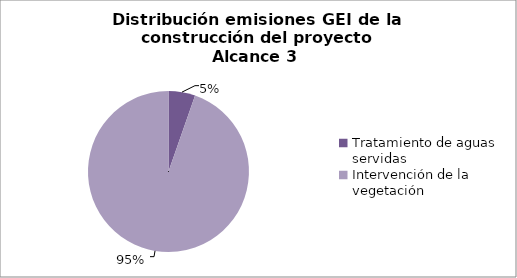
| Category | Series 0 |
|---|---|
| Tratamiento de aguas servidas | 447.417 |
| Intervención de la vegetación | 7906.604 |